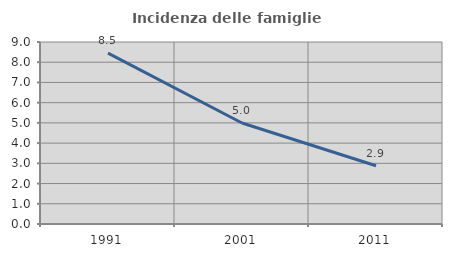
| Category | Incidenza delle famiglie numerose |
|---|---|
| 1991.0 | 8.451 |
| 2001.0 | 4.994 |
| 2011.0 | 2.881 |